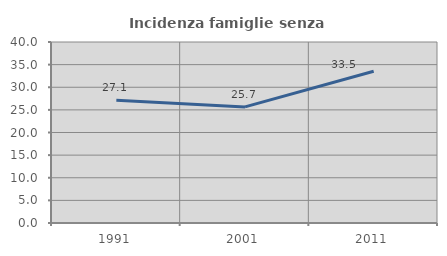
| Category | Incidenza famiglie senza nuclei |
|---|---|
| 1991.0 | 27.134 |
| 2001.0 | 25.661 |
| 2011.0 | 33.546 |